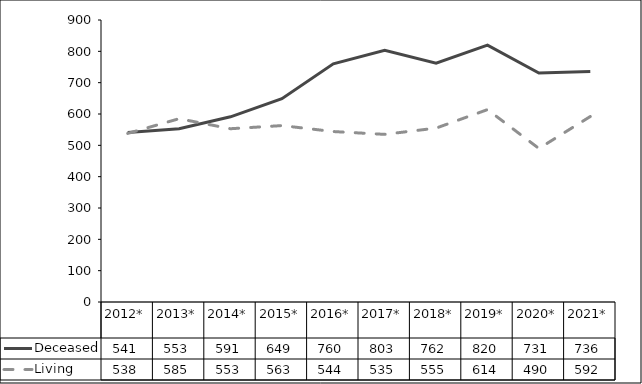
| Category | Deceased | Living |
|---|---|---|
| 2012* | 541 | 538 |
| 2013* | 553 | 585 |
| 2014* | 591 | 553 |
| 2015* | 649 | 563 |
| 2016* | 760 | 544 |
| 2017* | 803 | 535 |
| 2018* | 762 | 555 |
| 2019* | 820 | 614 |
| 2020* | 731 | 490 |
| 2021* | 736 | 592 |